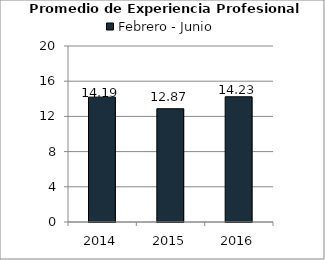
| Category | Febrero - Junio |
|---|---|
| 2014.0 | 14.19 |
| 2015.0 | 12.87 |
| 2016.0 | 14.23 |